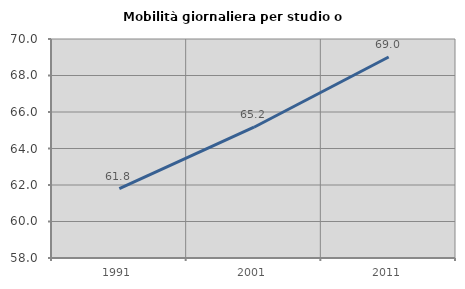
| Category | Mobilità giornaliera per studio o lavoro |
|---|---|
| 1991.0 | 61.805 |
| 2001.0 | 65.167 |
| 2011.0 | 69.015 |